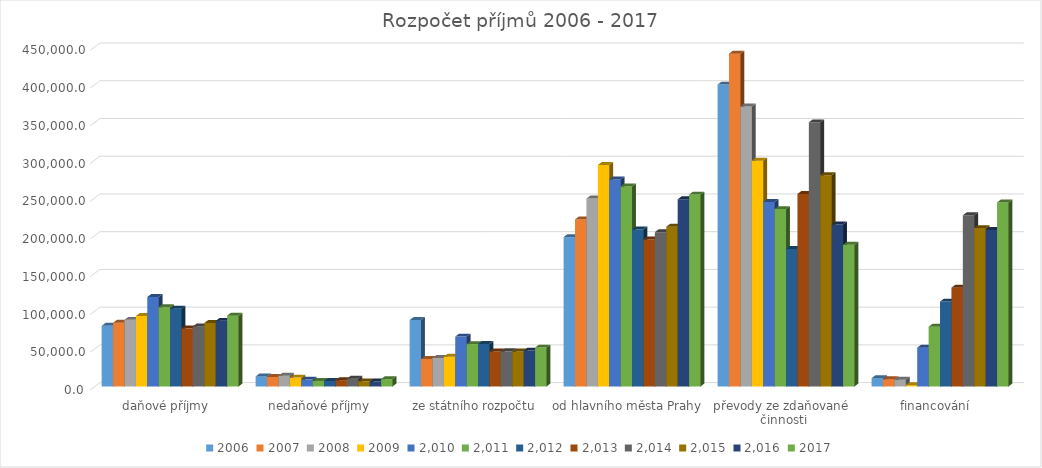
| Category | 2006 | 2007 | 2008 | 2009 | 2 010 | 2 011 | 2 012 | 2 013 | 2 014 | 2 015 | 2 016 | 2017 |
|---|---|---|---|---|---|---|---|---|---|---|---|---|
| daňové příjmy | 80367.6 | 84369.1 | 88280 | 93325 | 118555 | 105129.5 | 102955 | 77020 | 79600 | 84100 | 86960 | 93860 |
| nedaňové příjmy | 13300 | 12700 | 14193.9 | 11733 | 9083 | 7180 | 7410 | 8300 | 10350 | 6800 | 6550 | 9800 |
| ze státního rozpočtu | 88003 | 36384 | 37709 | 39501 | 66084 | 56166 | 56447 | 46393 | 46587 | 46379 | 47565 | 51513 |
| od hlavního města Prahy | 197863 | 221328 | 248989 | 293443 | 274369 | 265067 | 208070 | 194786 | 204481 | 211724 | 247982 | 254238 |
| převody ze zdaňované 
činnosti | 400000 | 441000 | 371062 | 299045.2 | 244555.1 | 235000 | 182238.6 | 255051.8 | 350000 | 280000 | 214780.6 | 187815 |
| financování | 11000 | 9731.6 | 9071.2 | 1732.6 | 51400 | 79149.5 | 112488.5 | 130907.5 | 226838.9 | 209840.7 | 207363.5 | 243879.3 |